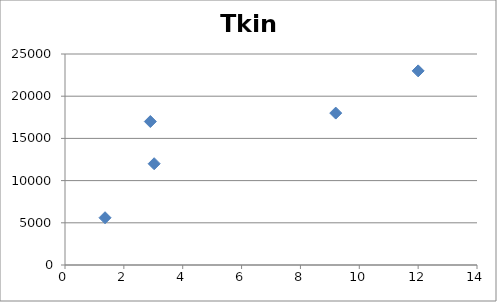
| Category | Tkin |
|---|---|
| 1.36 | 5600 |
| 2.9 | 17000 |
| 3.03 | 12000 |
| 9.2 | 18000 |
| 12.0 | 23000 |